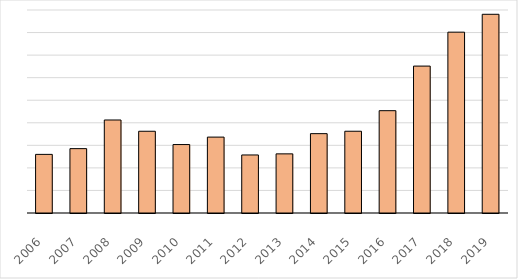
| Category | UKUPNO |
|---|---|
| 2006.0 | 259880 |
| 2007.0 | 285345 |
| 2008.0 | 412352 |
| 2009.0 | 362430 |
| 2010.0 | 303454 |
| 2011.0 | 336484 |
| 2012.0 | 257288 |
| 2013.0 | 262183 |
| 2014.0 | 351834 |
| 2015.0 | 362447 |
| 2016.0 | 453652 |
| 2017.0 | 651364 |
| 2018.0 | 801708 |
| 2019.0 | 880996 |